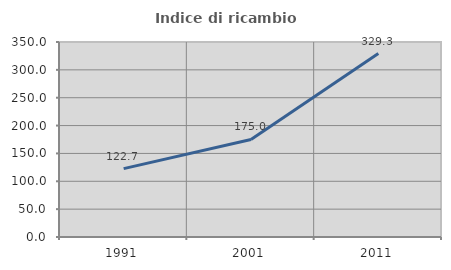
| Category | Indice di ricambio occupazionale  |
|---|---|
| 1991.0 | 122.665 |
| 2001.0 | 175.029 |
| 2011.0 | 329.33 |